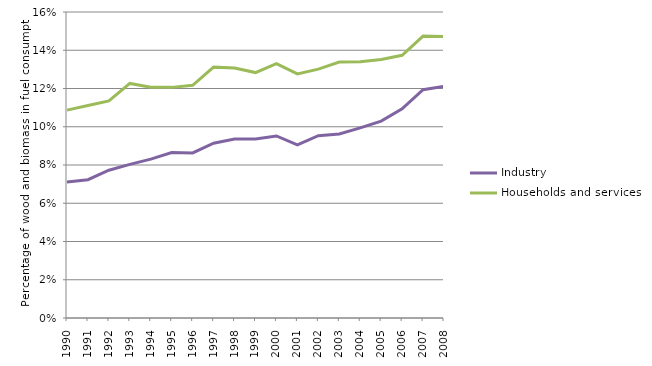
| Category | Industry | Households and services |
|---|---|---|
| 1990.0 | 0.071 | 0.109 |
| 1991.0 | 0.072 | 0.111 |
| 1992.0 | 0.077 | 0.113 |
| 1993.0 | 0.08 | 0.123 |
| 1994.0 | 0.083 | 0.121 |
| 1995.0 | 0.087 | 0.121 |
| 1996.0 | 0.086 | 0.122 |
| 1997.0 | 0.091 | 0.131 |
| 1998.0 | 0.094 | 0.131 |
| 1999.0 | 0.094 | 0.128 |
| 2000.0 | 0.095 | 0.133 |
| 2001.0 | 0.091 | 0.128 |
| 2002.0 | 0.095 | 0.13 |
| 2003.0 | 0.096 | 0.134 |
| 2004.0 | 0.099 | 0.134 |
| 2005.0 | 0.103 | 0.135 |
| 2006.0 | 0.109 | 0.137 |
| 2007.0 | 0.119 | 0.147 |
| 2008.0 | 0.121 | 0.147 |